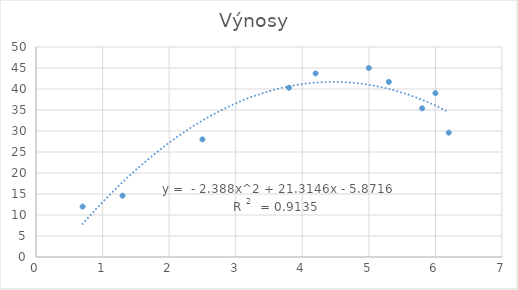
| Category | Výnosy  |
|---|---|
| 0.7 | 12 |
| 1.3 | 14.6 |
| 3.8 | 40.3 |
| 4.2 | 43.7 |
| 2.5 | 28 |
| 5.0 | 45 |
| 5.3 | 41.7 |
| 6.0 | 39 |
| 5.8 | 35.4 |
| 6.2 | 29.6 |